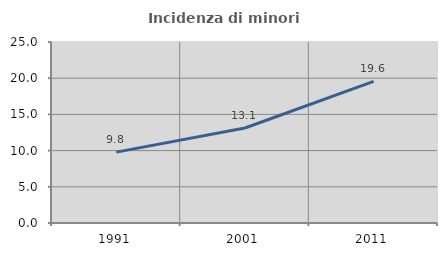
| Category | Incidenza di minori stranieri |
|---|---|
| 1991.0 | 9.792 |
| 2001.0 | 13.126 |
| 2011.0 | 19.553 |